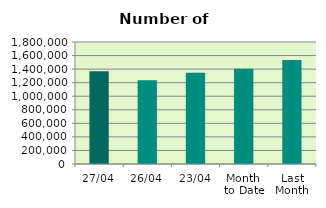
| Category | Series 0 |
|---|---|
| 27/04 | 1366886 |
| 26/04 | 1237120 |
| 23/04 | 1345320 |
| Month 
to Date | 1406850.471 |
| Last
Month | 1535393.739 |